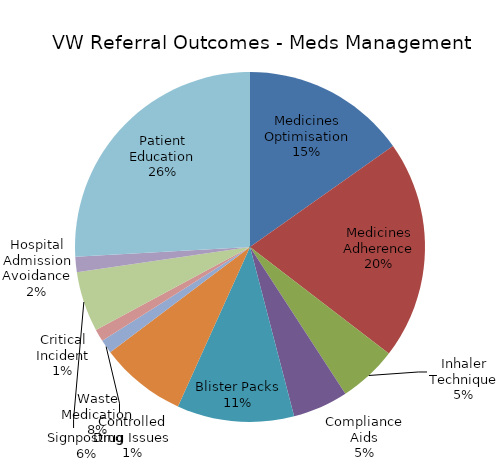
| Category | Series 0 |
|---|---|
| Medicines Optimisation | 107 |
| Medicines Adherence | 142 |
| Inhaler Technique | 38 |
| Compliance Aids | 36 |
| Blister Packs | 76 |
| Waste Medication | 56 |
| Controlled Drug Issues | 9 |
| Critical Incident | 8 |
| Signposting | 39 |
| Hospital Admission Avoidance | 10 |
| Patient Education | 182 |